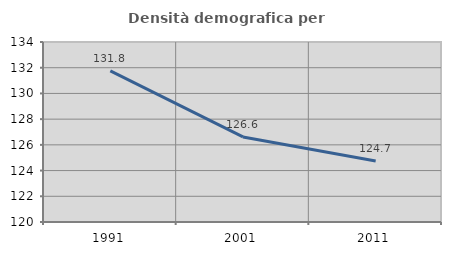
| Category | Densità demografica |
|---|---|
| 1991.0 | 131.757 |
| 2001.0 | 126.618 |
| 2011.0 | 124.749 |